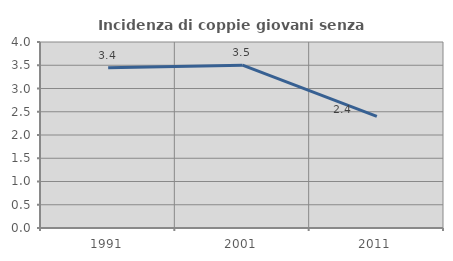
| Category | Incidenza di coppie giovani senza figli |
|---|---|
| 1991.0 | 3.448 |
| 2001.0 | 3.501 |
| 2011.0 | 2.4 |